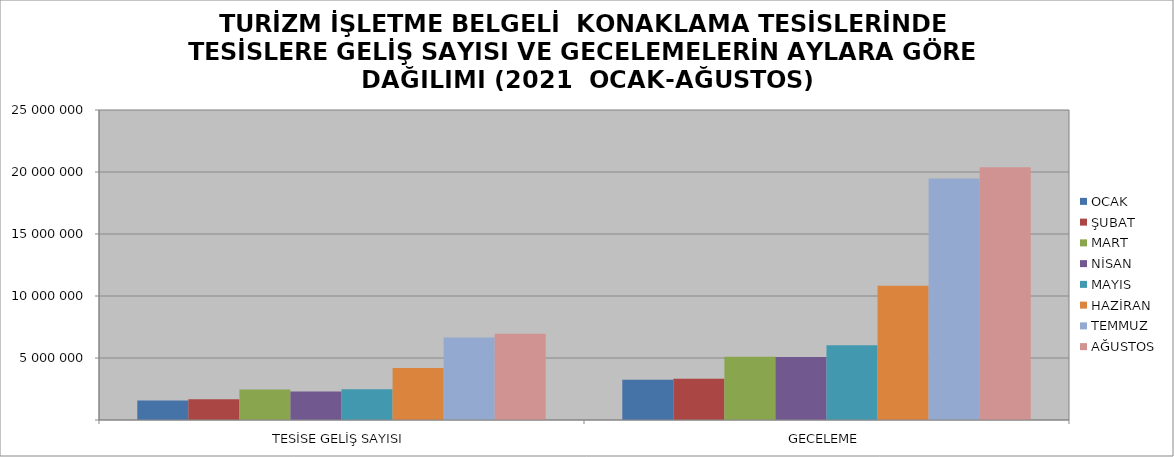
| Category | OCAK | ŞUBAT | MART | NİSAN | MAYIS | HAZİRAN | TEMMUZ | AĞUSTOS |
|---|---|---|---|---|---|---|---|---|
| TESİSE GELİŞ SAYISI | 1571594 | 1670164 | 2462715 | 2305703 | 2480312 | 4203299 | 6647723 | 6953153 |
| GECELEME | 3239980 | 3333484 | 5094921 | 5081446 | 6019981 | 10819754 | 19475865 | 20388962 |